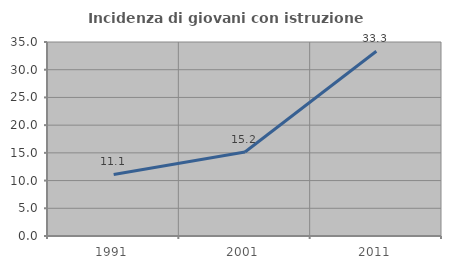
| Category | Incidenza di giovani con istruzione universitaria |
|---|---|
| 1991.0 | 11.111 |
| 2001.0 | 15.152 |
| 2011.0 | 33.333 |